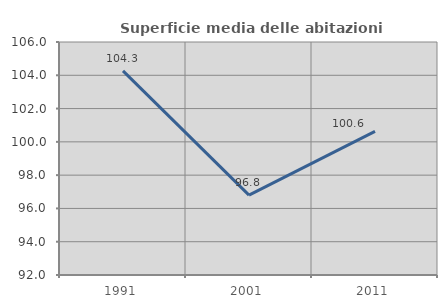
| Category | Superficie media delle abitazioni occupate |
|---|---|
| 1991.0 | 104.267 |
| 2001.0 | 96.8 |
| 2011.0 | 100.633 |